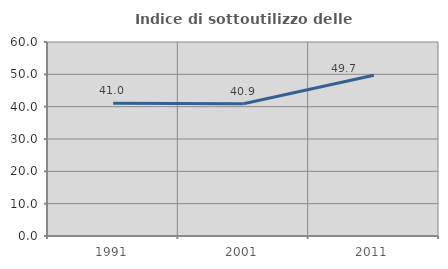
| Category | Indice di sottoutilizzo delle abitazioni  |
|---|---|
| 1991.0 | 41.038 |
| 2001.0 | 40.884 |
| 2011.0 | 49.721 |